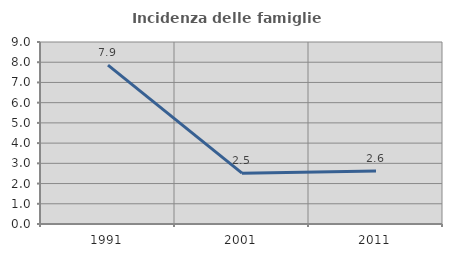
| Category | Incidenza delle famiglie numerose |
|---|---|
| 1991.0 | 7.855 |
| 2001.0 | 2.514 |
| 2011.0 | 2.618 |